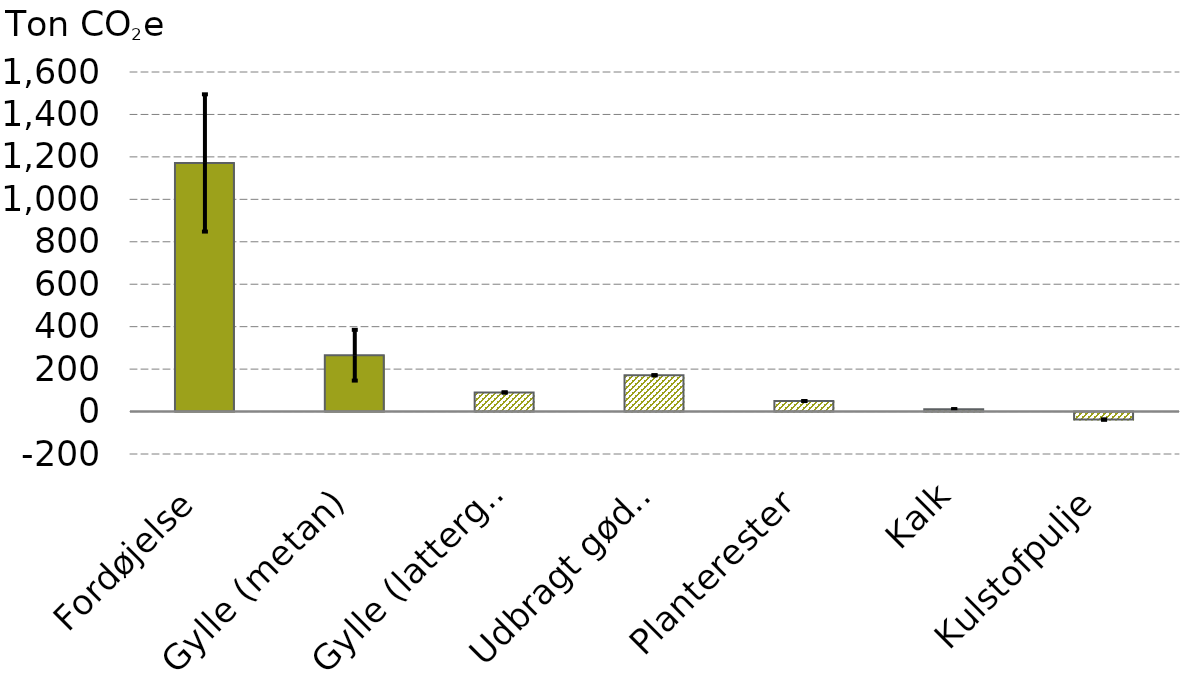
| Category |  Direkte udledninger  |
|---|---|
| Fordøjelse | 1171.449 |
| Gylle (metan) | 265.56 |
| Gylle (lattergas) | 89.93 |
| Udbragt gødning | 171 |
| Planterester | 49.55 |
| Kalk | 11 |
| Kulstofpulje | -37.8 |